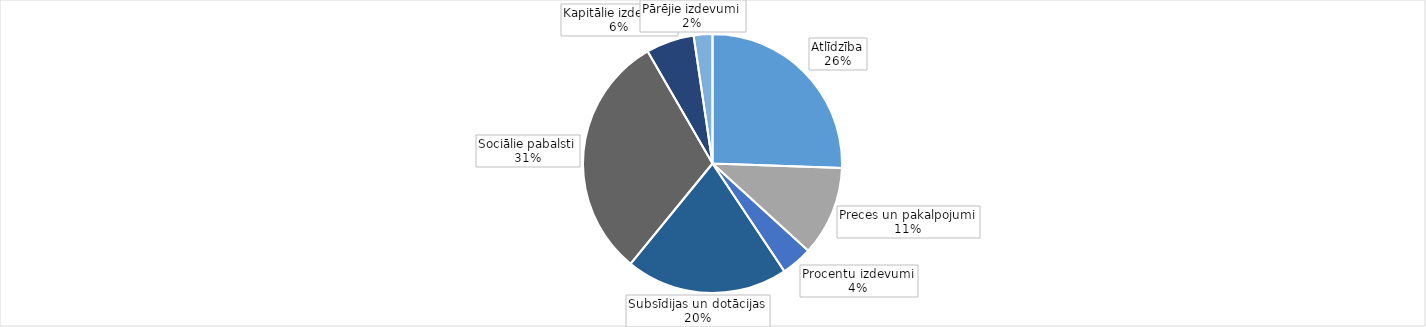
| Category | Series 0 |
|---|---|
| Atlīdzība | 348178.334 |
| Preces un pakalpojumi | 152661.94 |
| Procentu izdevumi | 52893.783 |
| Subsīdijas un dotācijas | 276152.987 |
| Sociālie pabalsti | 418943.798 |
| Kapitālie izdevumi | 81826.278 |
| Pārējie izdevumi | 31886.981 |